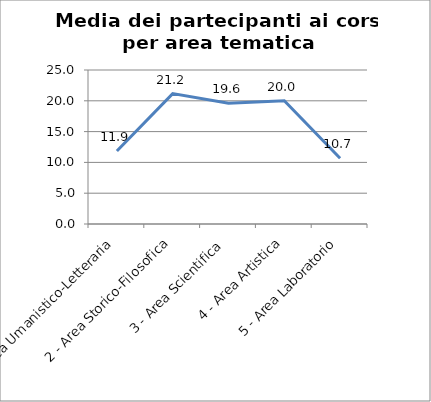
| Category | Media dei partecipanti ai corsi |
|---|---|
| 1 - Area Umanistico-Letteraria | 11.851 |
| 2 - Area Storico-Filosofica | 21.167 |
| 3 - Area Scientifica | 19.6 |
| 4 - Area Artistica | 20 |
| 5 - Area Laboratorio | 10.667 |